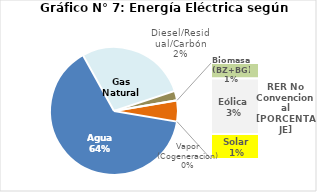
| Category | Series 0 |
|---|---|
| Agua | 3176.727 |
| Gas Natural | 1383.714 |
| Diesel/Residual/Carbón | 119.964 |
| Vapor (Cogeneracion) | 0.39 |
| Biomasa (BZ+BG) | 42.784 |
| Eólica | 152.599 |
| Solar | 68.403 |